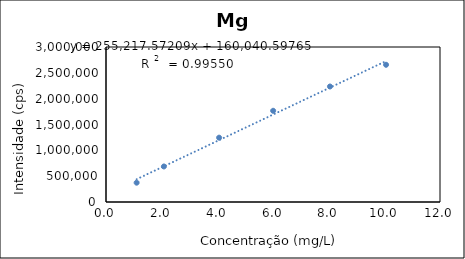
| Category | Series 0 |
|---|---|
| 1.1006602233796918 | 373977.87 |
| 2.0803236067567203 | 687773.87 |
| 4.063805133013004 | 1245022.87 |
| 6.005217887512102 | 1765462.87 |
| 8.046783249942898 | 2235332.87 |
| 10.06194264087556 | 2655972.87 |